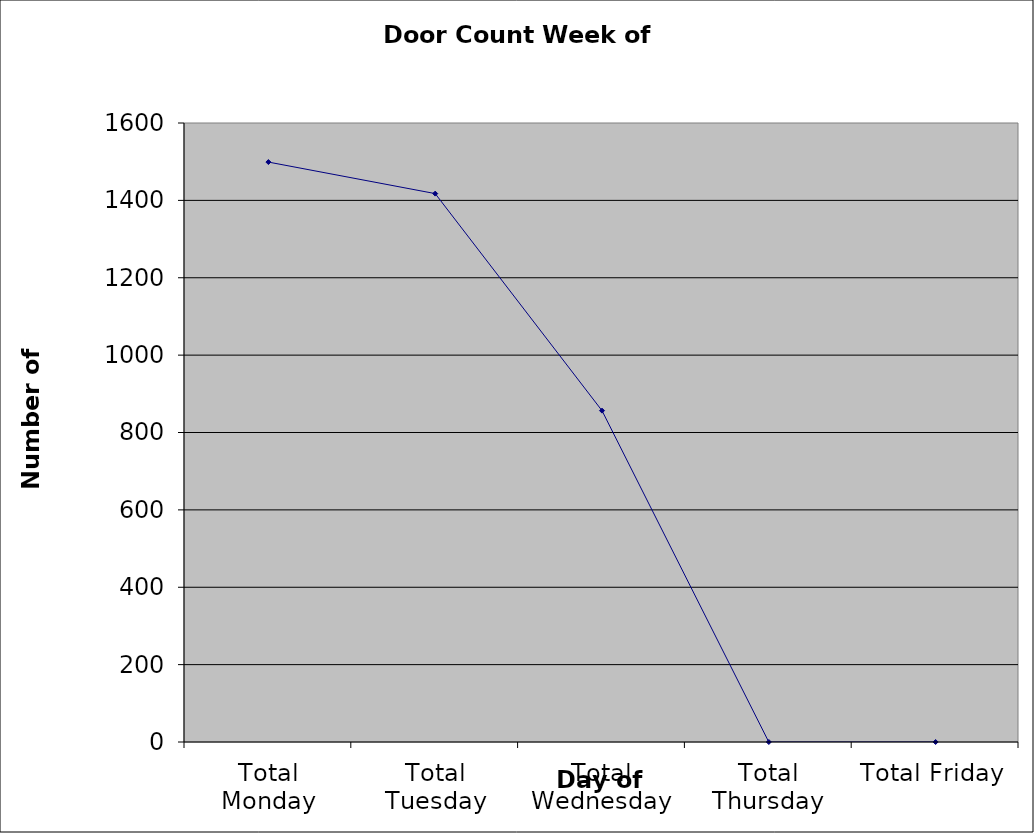
| Category | Series 0 |
|---|---|
| Total Monday | 1499 |
| Total Tuesday | 1417.5 |
| Total Wednesday | 856.5 |
| Total Thursday | 0 |
| Total Friday | 0 |